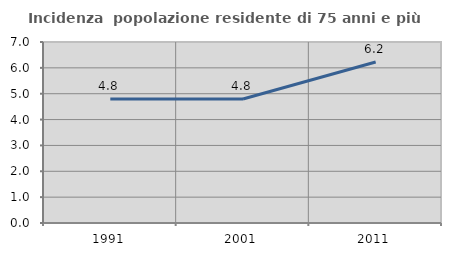
| Category | Incidenza  popolazione residente di 75 anni e più |
|---|---|
| 1991.0 | 4.799 |
| 2001.0 | 4.796 |
| 2011.0 | 6.228 |